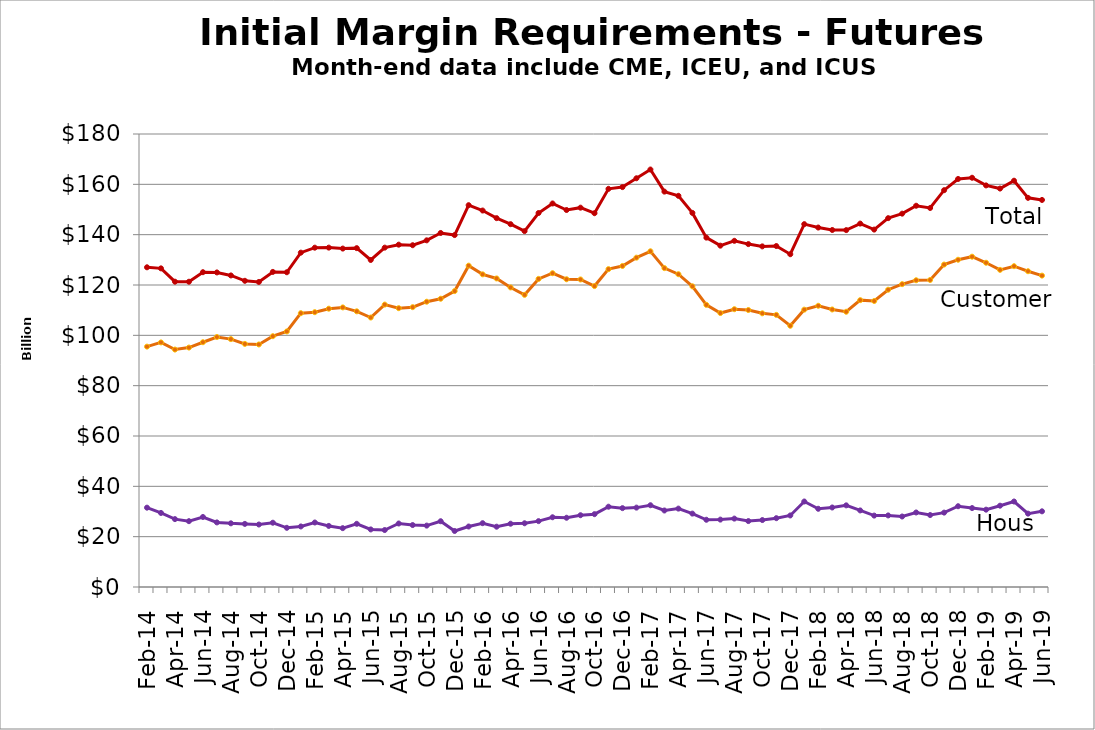
| Category | Customer | House | Total |
|---|---|---|---|
| 2014-02-28 |  |  |  |
| nan |  |  |  |
| 2014-04-30 |  |  |  |
| nan |  |  |  |
| 2014-06-30 |  |  |  |
| nan |  |  |  |
| 2014-08-29 |  |  |  |
| nan |  |  |  |
| 2014-10-31 |  |  |  |
| nan |  |  |  |
| 2014-12-31 |  |  |  |
| nan |  |  |  |
| 2015-02-27 |  |  |  |
| nan |  |  |  |
| 2015-04-30 |  |  |  |
| nan |  |  |  |
| 2015-06-30 |  |  |  |
| nan |  |  |  |
| 2015-08-31 |  |  |  |
| nan |  |  |  |
| 2015-10-30 |  |  |  |
| nan |  |  |  |
| 2015-12-31 |  |  |  |
| nan |  |  |  |
| 2016-02-29 |  |  |  |
| nan |  |  |  |
| 2016-04-29 |  |  |  |
| nan |  |  |  |
| 2016-06-30 |  |  |  |
| nan |  |  |  |
| 2016-08-31 |  |  |  |
| nan |  |  |  |
| 2016-10-31 |  |  |  |
| nan |  |  |  |
| 2016-12-30 |  |  |  |
| nan |  |  |  |
| 2017-02-28 |  |  |  |
| nan |  |  |  |
| 2017-04-28 |  |  |  |
| nan |  |  |  |
| 2017-06-30 |  |  |  |
| nan |  |  |  |
| 2017-08-31 |  |  |  |
| nan |  |  |  |
| 2017-10-31 |  |  |  |
| nan |  |  |  |
| 2017-12-29 |  |  |  |
| nan |  |  |  |
| 2018-02-28 |  |  |  |
| nan |  |  |  |
| 2018-04-30 |  |  |  |
| nan |  |  |  |
| 2018-06-29 |  |  |  |
| nan |  |  |  |
| 2018-08-31 |  |  |  |
| nan |  |  |  |
| 2018-10-31 |  |  |  |
| nan |  |  |  |
| 2018-12-31 |  |  |  |
| nan |  |  |  |
| 2019-02-28 |  |  |  |
| nan |  |  |  |
| 2019-04-30 |  |  |  |
| nan |  |  |  |
| 2019-06-28 |  |  |  |